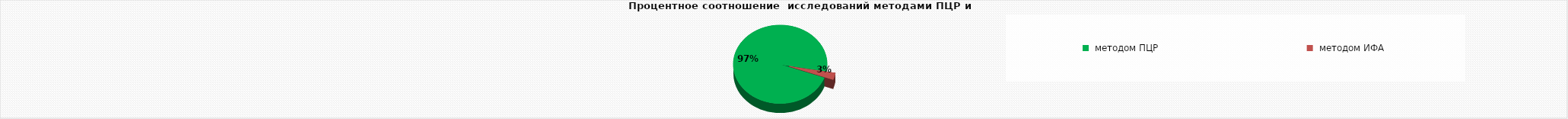
| Category | сыворотка | 1719 |
|---|---|---|
|  методом ПЦР | 1719 |  |
|  методом ИФА | 49 |  |